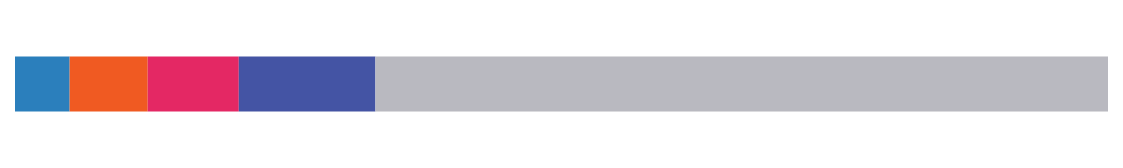
| Category | Series 0 | Series 1 | Series 2 | Series 3 | Series 4 |
|---|---|---|---|---|---|
| 0 | 0.05 | 0.071 | 0.083 | 0.125 | 0.67 |